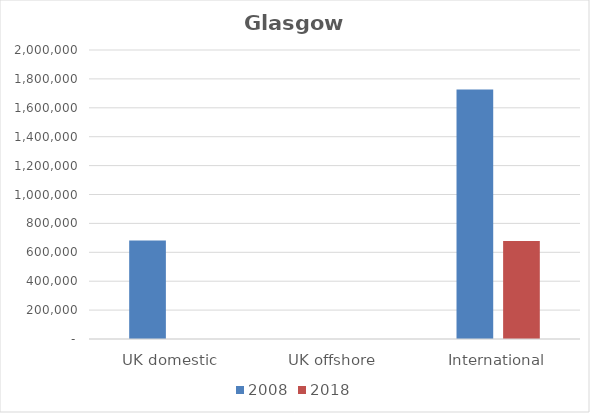
| Category | 2008 | 2018 |
|---|---|---|
| UK domestic | 682327 | 738 |
| UK offshore | 0 | 0 |
| International | 1726508 | 678769 |